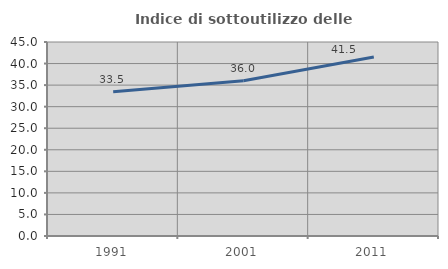
| Category | Indice di sottoutilizzo delle abitazioni  |
|---|---|
| 1991.0 | 33.48 |
| 2001.0 | 36.032 |
| 2011.0 | 41.532 |